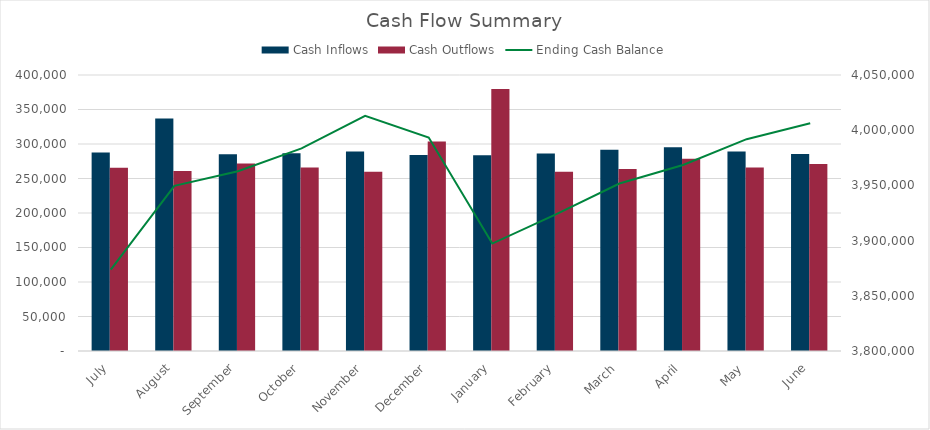
| Category | Cash Inflows | Cash Outflows |
|---|---|---|
| July | 287591.25 | 265418 |
| August | 336863.695 | 260897 |
| September | 284993.769 | 271843 |
| October | 286612.215 | 265889 |
| November | 289279.413 | 259810 |
| December | 283994.815 | 303548 |
| January | 283793.63 | 379884 |
| February | 286381.151 | 259870 |
| March | 291771.32 | 263879 |
| April | 295274.134 | 278490 |
| May | 289268.457 | 265889 |
| June | 285393.152 | 270899 |